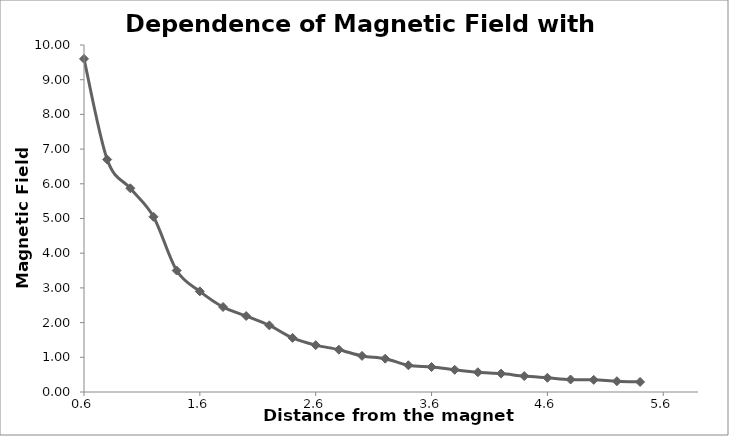
| Category | Distance Magnetic Field |
|---|---|
| 0.6 | 9.6 |
| 0.8 | 6.7 |
| 1.0 | 5.87 |
| 1.2 | 5.05 |
| 1.4 | 3.5 |
| 1.6 | 2.9 |
| 1.8 | 2.45 |
| 2.0 | 2.19 |
| 2.2 | 1.92 |
| 2.4 | 1.56 |
| 2.6 | 1.35 |
| 2.8 | 1.22 |
| 3.0 | 1.04 |
| 3.2 | 0.96 |
| 3.4 | 0.77 |
| 3.6 | 0.72 |
| 3.8 | 0.64 |
| 4.0 | 0.57 |
| 4.2 | 0.53 |
| 4.4 | 0.46 |
| 4.6 | 0.41 |
| 4.8 | 0.36 |
| 5.0 | 0.35 |
| 5.2 | 0.31 |
| 5.4 | 0.29 |